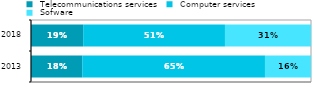
| Category |  Telecommunications services |  Computer services |  Sofware |
|---|---|---|---|
| 2013.0 | 0.183 | 0.652 | 0.164 |
| 2018.0 | 0.186 | 0.506 | 0.307 |